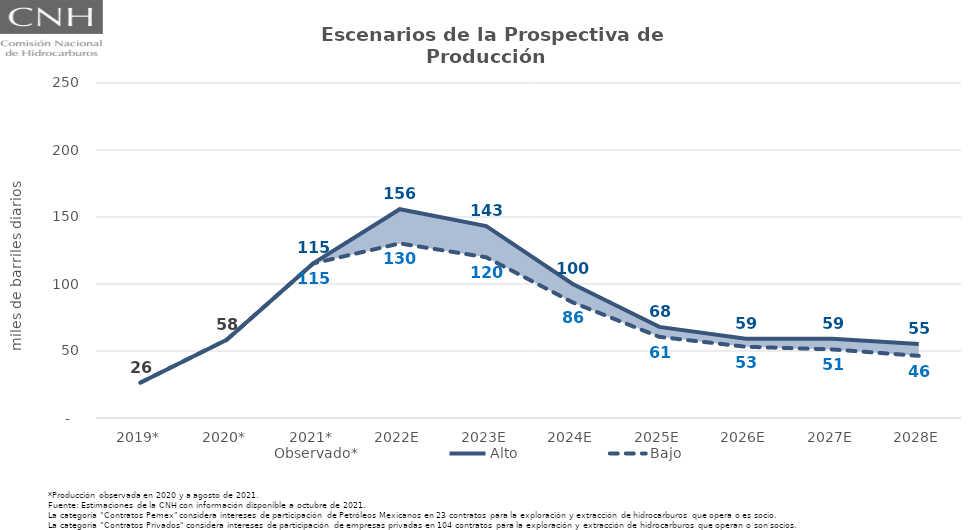
| Category | Observado* | Alto | Bajo |
|---|---|---|---|
| 2019* | 26.35 | 26.35 | 26.35 |
| 2020* | 58.4 | 58.4 | 58.4 |
| 2021* | 115.364 | 115.364 | 115.364 |
| 2022E | 143.035 | 155.819 | 130.283 |
| 2023E | 131.133 | 143.215 | 119.938 |
| 2024E | 92.005 | 100.005 | 86.246 |
| 2025E | 62.171 | 68.017 | 60.571 |
| 2026E | 53.634 | 59.201 | 53.171 |
| 2027E | 51.61 | 59.051 | 51.203 |
| 2028E | 46.584 | 55.173 | 46.384 |